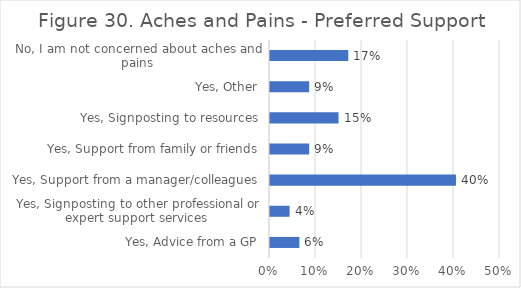
| Category | Series 0 |
|---|---|
| Yes, Advice from a GP | 0.064 |
| Yes, Signposting to other professional or expert support services  | 0.043 |
| Yes, Support from a manager/colleagues | 0.404 |
| Yes, Support from family or friends | 0.085 |
| Yes, Signposting to resources | 0.149 |
| Yes, Other | 0.085 |
| No, I am not concerned about aches and pains | 0.17 |